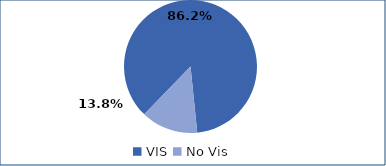
| Category | Series 0 |
|---|---|
| VIS | 0.862 |
| No Vis | 0.138 |